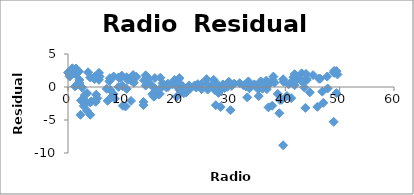
| Category | Series 0 |
|---|---|
| 37.8 | 1.576 |
| 39.3 | -1.938 |
| 45.9 | -3.008 |
| 41.3 | 0.902 |
| 10.8 | -0.289 |
| 48.9 | -5.278 |
| 32.8 | 0.07 |
| 19.6 | 1.077 |
| 2.1 | 1.073 |
| 2.6 | -1.951 |
| 5.8 | 1.568 |
| 24.0 | 0.115 |
| 35.1 | -1.377 |
| 7.6 | 0.874 |
| 32.9 | 0.566 |
| 47.7 | 1.581 |
| 36.6 | -0.324 |
| 39.6 | 1.175 |
| 20.5 | 1.348 |
| 23.9 | 0.434 |
| 27.7 | -0.101 |
| 5.1 | -2.241 |
| 15.9 | -0.889 |
| 16.9 | -1.046 |
| 12.6 | 1.553 |
| 3.5 | -3.61 |
| 29.3 | 0.01 |
| 16.7 | -1.152 |
| 27.1 | -0.511 |
| 16.0 | 1.356 |
| 28.3 | -0.234 |
| 17.4 | 0.554 |
| 1.5 | 1.961 |
| 20.0 | -1.464 |
| 1.4 | 1.925 |
| 4.1 | -4.207 |
| 43.8 | 1.994 |
| 49.4 | -0.923 |
| 26.7 | 0.191 |
| 37.7 | 1.052 |
| 22.3 | 0.222 |
| 33.4 | -0.196 |
| 27.7 | -0.896 |
| 8.4 | -1.064 |
| 25.7 | -0.388 |
| 22.5 | -0.262 |
| 9.9 | 1.727 |
| 41.5 | 1.477 |
| 15.8 | -1.464 |
| 11.7 | 1.532 |
| 3.1 | -1.231 |
| 9.6 | 1.36 |
| 41.7 | 1.937 |
| 46.2 | 1.255 |
| 28.8 | -0.174 |
| 49.4 | 2.407 |
| 28.1 | -3.028 |
| 19.2 | 0.425 |
| 49.6 | 1.902 |
| 29.5 | 0.267 |
| 2.0 | 2.358 |
| 42.7 | 1.309 |
| 15.5 | -1.084 |
| 29.6 | 0.789 |
| 42.8 | 1.022 |
| 9.3 | 1.451 |
| 24.6 | 0.484 |
| 14.5 | 1.363 |
| 27.5 | -0.077 |
| 43.9 | 1.191 |
| 30.6 | 0.521 |
| 14.3 | 1.773 |
| 33.0 | -1.567 |
| 5.7 | 1.097 |
| 24.6 | -0.329 |
| 43.7 | -3.158 |
| 1.6 | 2.422 |
| 28.5 | 0.388 |
| 29.9 | -3.513 |
| 7.7 | 1.325 |
| 26.7 | 0.354 |
| 4.1 | -2.348 |
| 20.3 | 1.122 |
| 44.5 | -0.822 |
| 43.0 | 0.919 |
| 18.4 | 0.019 |
| 27.5 | 0.401 |
| 40.6 | 0.406 |
| 25.5 | 1.189 |
| 47.8 | -0.222 |
| 4.9 | 1.201 |
| 1.5 | 2.804 |
| 33.5 | 0.244 |
| 36.5 | 0.972 |
| 14.0 | 1.018 |
| 31.6 | 0.585 |
| 3.5 | -0.936 |
| 21.0 | 0.163 |
| 42.3 | 1.281 |
| 41.7 | 0.26 |
| 4.3 | -2.176 |
| 36.3 | 0.558 |
| 10.1 | -2.844 |
| 17.2 | -0.062 |
| 34.3 | 0.399 |
| 46.4 | 1.264 |
| 11.0 | 1.074 |
| 0.3 | 1.591 |
| 0.4 | 1.713 |
| 26.9 | 0.107 |
| 8.2 | -1.36 |
| 38.0 | 0.66 |
| 15.4 | 0.219 |
| 20.6 | -0.504 |
| 46.8 | -0.705 |
| 35.0 | -0.32 |
| 14.3 | 0.221 |
| 0.8 | 2.829 |
| 36.9 | 0.334 |
| 16.0 | -0.22 |
| 26.8 | 1.09 |
| 21.7 | -0.838 |
| 2.4 | -2.026 |
| 34.6 | 0.117 |
| 32.3 | 0.246 |
| 11.8 | 1.473 |
| 38.9 | -3.977 |
| 0.0 | 2.2 |
| 49.0 | 2.445 |
| 12.0 | 1.816 |
| 39.6 | -8.828 |
| 2.9 | -2.878 |
| 27.2 | -2.749 |
| 33.5 | 0.333 |
| 38.6 | -1.037 |
| 47.0 | -2.401 |
| 39.0 | -1.953 |
| 28.9 | -0.051 |
| 25.9 | -0.168 |
| 43.9 | 1.025 |
| 17.0 | 1.41 |
| 35.4 | 0.801 |
| 33.2 | 0.85 |
| 5.7 | 1.635 |
| 14.8 | 1.309 |
| 1.9 | 0.591 |
| 7.3 | -2.094 |
| 49.0 | 2.139 |
| 40.3 | -1.363 |
| 25.8 | 0.273 |
| 13.9 | -2.267 |
| 8.4 | 1.59 |
| 23.3 | 0.24 |
| 39.7 | 0.776 |
| 21.1 | 0.098 |
| 11.6 | -2.108 |
| 43.5 | -0.085 |
| 1.3 | 0.086 |
| 36.9 | -3.084 |
| 18.4 | 0.501 |
| 18.1 | 0.186 |
| 35.8 | -0.259 |
| 18.1 | -0.047 |
| 36.8 | 0.648 |
| 14.7 | 0.832 |
| 3.4 | -2.324 |
| 37.6 | -2.824 |
| 5.2 | -1.163 |
| 23.6 | -0.086 |
| 10.6 | -2.942 |
| 11.6 | 1.005 |
| 20.9 | 0.142 |
| 20.1 | -0.008 |
| 7.1 | -0.271 |
| 3.4 | -2.244 |
| 48.9 | 2.213 |
| 30.2 | 0.221 |
| 7.8 | -0.462 |
| 2.3 | -4.211 |
| 10.0 | 0.215 |
| 2.6 | -0.087 |
| 5.4 | -1.728 |
| 5.7 | 2.145 |
| 43.0 | 2.067 |
| 21.3 | -0.939 |
| 45.1 | 1.797 |
| 2.1 | 0.609 |
| 28.7 | 0.224 |
| 13.9 | -2.744 |
| 12.1 | 0.648 |
| 41.1 | -1.689 |
| 10.8 | 1.476 |
| 4.1 | 1.434 |
| 42.0 | 1.113 |
| 35.6 | 0.805 |
| 3.7 | 2.23 |
| 4.9 | 1.535 |
| 9.3 | 0.014 |
| 42.0 | 1.733 |
| 8.6 | -1.773 |